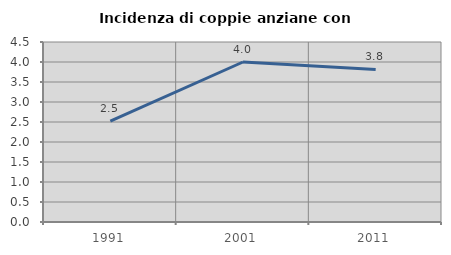
| Category | Incidenza di coppie anziane con figli |
|---|---|
| 1991.0 | 2.524 |
| 2001.0 | 4 |
| 2011.0 | 3.815 |